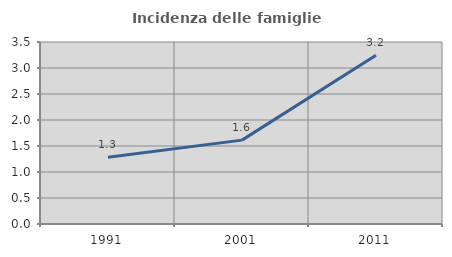
| Category | Incidenza delle famiglie numerose |
|---|---|
| 1991.0 | 1.282 |
| 2001.0 | 1.613 |
| 2011.0 | 3.243 |